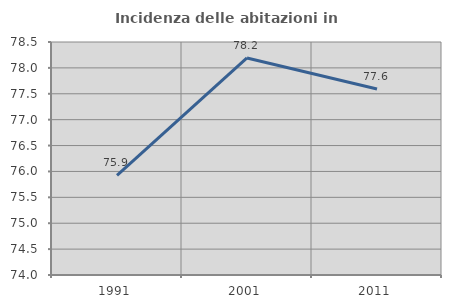
| Category | Incidenza delle abitazioni in proprietà  |
|---|---|
| 1991.0 | 75.926 |
| 2001.0 | 78.192 |
| 2011.0 | 77.592 |